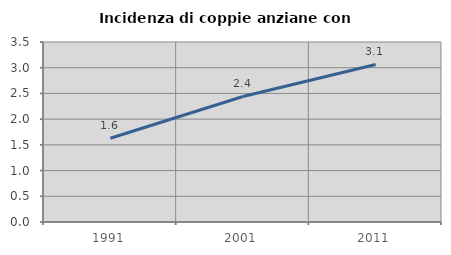
| Category | Incidenza di coppie anziane con figli |
|---|---|
| 1991.0 | 1.628 |
| 2001.0 | 2.441 |
| 2011.0 | 3.063 |